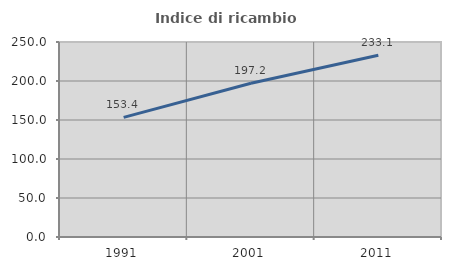
| Category | Indice di ricambio occupazionale  |
|---|---|
| 1991.0 | 153.398 |
| 2001.0 | 197.17 |
| 2011.0 | 233.071 |